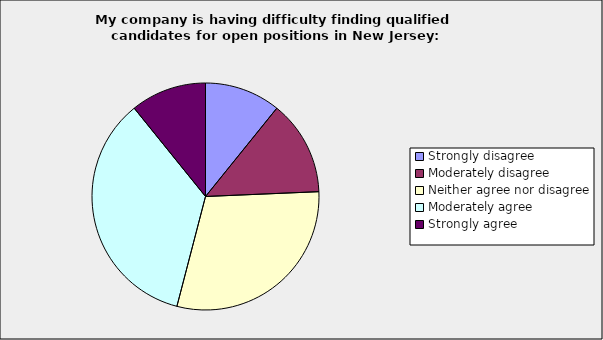
| Category | Series 0 |
|---|---|
| Strongly disagree | 0.108 |
| Moderately disagree | 0.135 |
| Neither agree nor disagree | 0.297 |
| Moderately agree | 0.351 |
| Strongly agree | 0.108 |